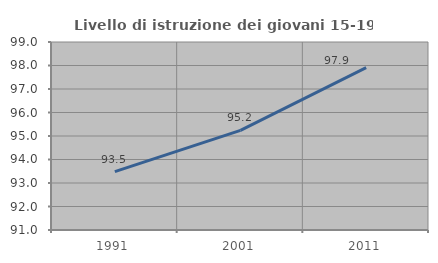
| Category | Livello di istruzione dei giovani 15-19 anni |
|---|---|
| 1991.0 | 93.487 |
| 2001.0 | 95.238 |
| 2011.0 | 97.908 |